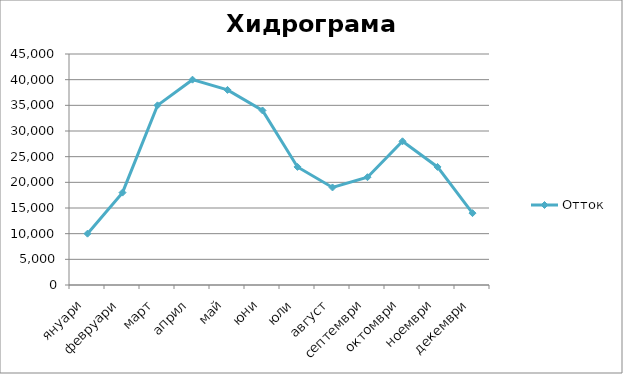
| Category | Отток |
|---|---|
| януари | 10000 |
| февруари | 18000 |
| март | 35000 |
| април | 40000 |
| май | 38000 |
| юни | 34000 |
| юли | 23000 |
| август | 19000 |
| септември | 21000 |
| октомври | 28000 |
| ноември | 23000 |
| декември | 14000 |